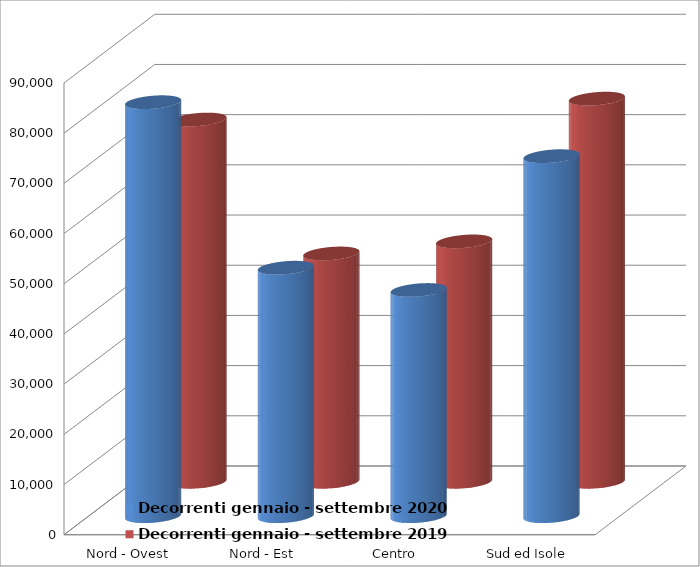
| Category | Decorrenti gennaio - settembre 2020 | Decorrenti gennaio - settembre 2019 |
|---|---|---|
| Nord - Ovest | 82474 | 72180 |
| Nord - Est | 49502 | 45496 |
| Centro | 45065 | 47898 |
| Sud ed Isole | 71722 | 76340 |